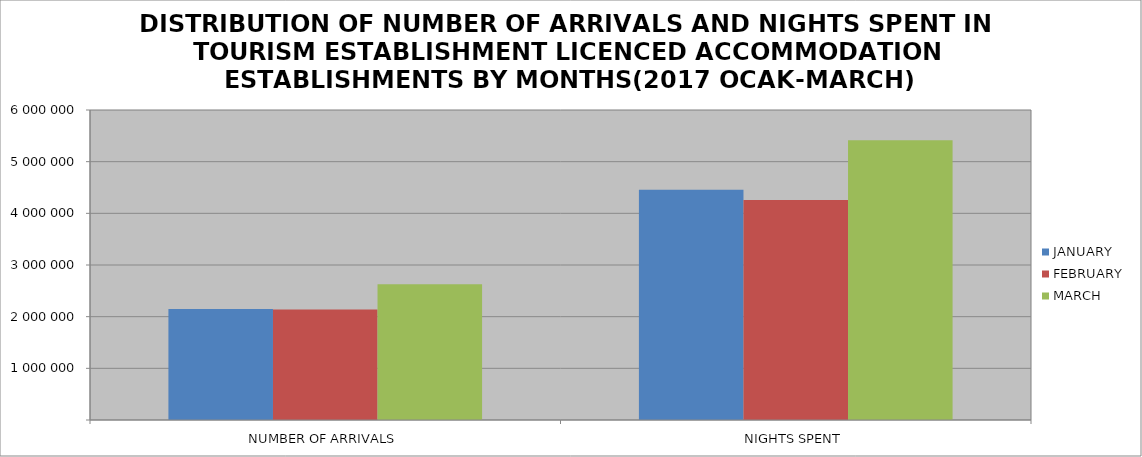
| Category | JANUARY | FEBRUARY | MARCH |
|---|---|---|---|
| NUMBER OF ARRIVALS | 2146994 | 2141043 | 2629734 |
| NIGHTS SPENT | 4457352 | 4260377 | 5413903 |